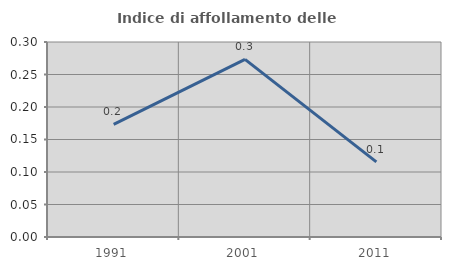
| Category | Indice di affollamento delle abitazioni  |
|---|---|
| 1991.0 | 0.173 |
| 2001.0 | 0.273 |
| 2011.0 | 0.115 |